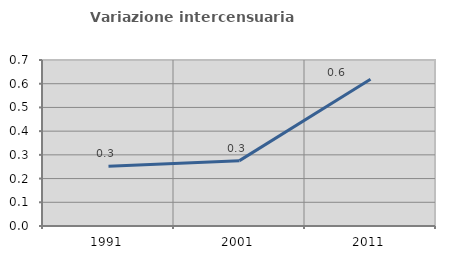
| Category | Variazione intercensuaria annua |
|---|---|
| 1991.0 | 0.252 |
| 2001.0 | 0.276 |
| 2011.0 | 0.619 |